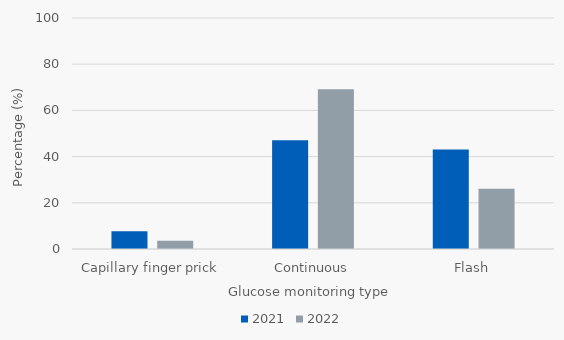
| Category | 2021 | 2022 |
|---|---|---|
| Capillary finger prick | 7.635 | 3.589 |
| Continuous | 47.044 | 69.139 |
| Flash | 43.103 | 26.077 |